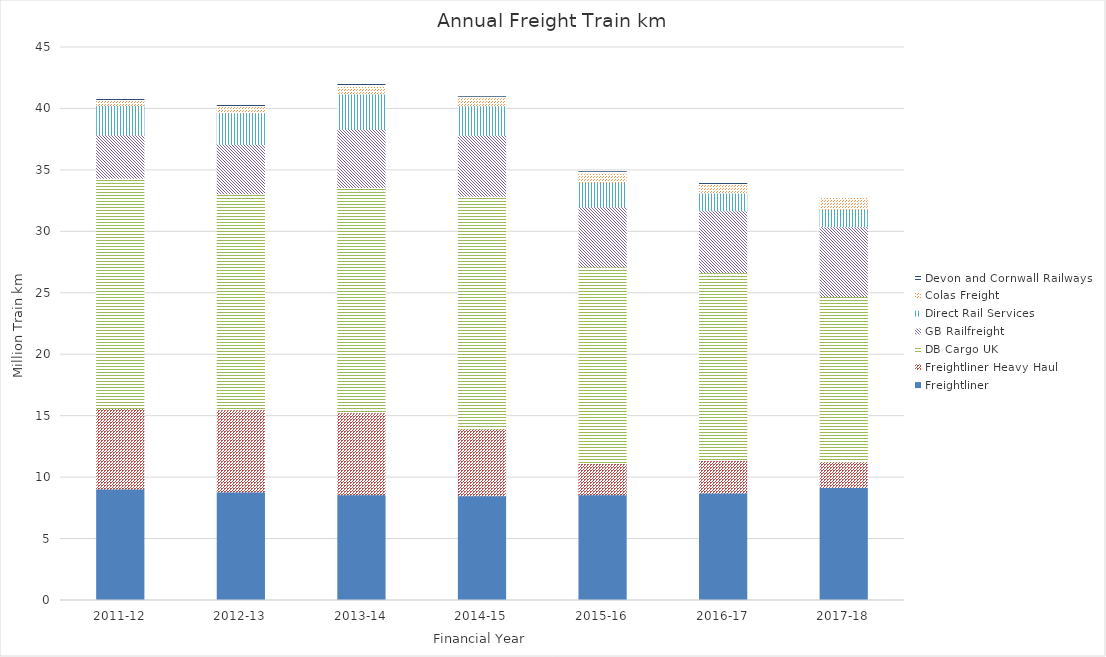
| Category | Freightliner | Freightliner Heavy Haul | DB Cargo UK | GB Railfreight | Direct Rail Services | Colas Freight | Devon and Cornwall Railways |
|---|---|---|---|---|---|---|---|
| 2011-12 | 9.074 | 6.557 | 18.735 | 3.526 | 2.386 | 0.495 | 0.02 |
| 2012-13 | 8.828 | 6.7 | 17.572 | 4.001 | 2.574 | 0.527 | 0.161 |
| 2013-14 | 8.6 | 6.677 | 18.336 | 4.728 | 2.873 | 0.613 | 0.172 |
| 2014-15 | 8.518 | 5.439 | 18.942 | 4.934 | 2.424 | 0.66 | 0.084 |
| 2015-16 | 8.608 | 2.532 | 15.991 | 4.911 | 1.963 | 0.76 | 0.119 |
| 2016-17 | 8.745 | 2.643 | 15.291 | 5.043 | 1.435 | 0.758 | 0.062 |
| 2017-18 | 9.197 | 2.097 | 13.437 | 5.675 | 1.404 | 0.992 | 0.075 |